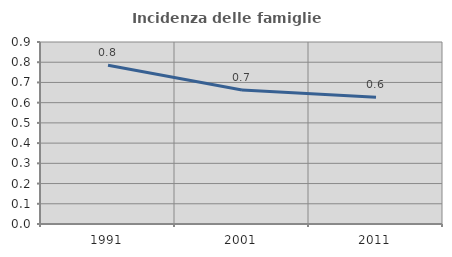
| Category | Incidenza delle famiglie numerose |
|---|---|
| 1991.0 | 0.785 |
| 2001.0 | 0.663 |
| 2011.0 | 0.627 |